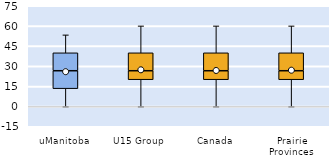
| Category | 25th | 50th | 75th |
|---|---|---|---|
| uManitoba | 13.333 | 13.333 | 13.333 |
| U15 Group | 20 | 6.667 | 13.333 |
| Canada | 20 | 6.667 | 13.333 |
| Prairie Provinces | 20 | 6.667 | 13.333 |